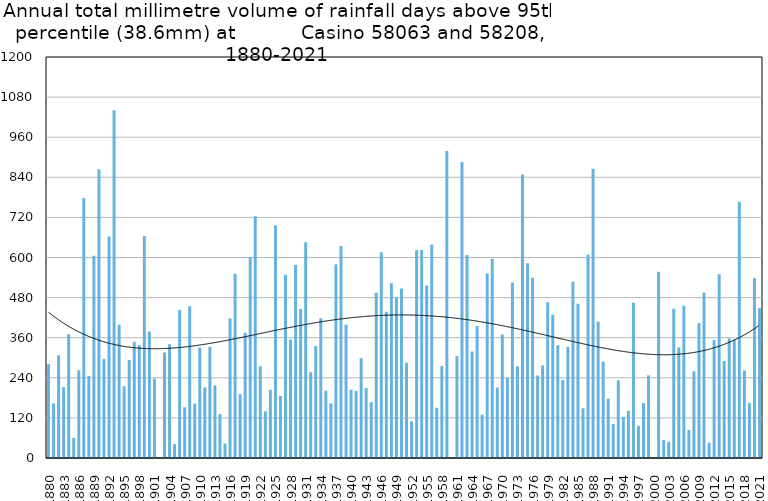
| Category | Annual total mm in days above 95th percentile |
|---|---|
| 1880 | 280.7 |
| 1881 | 163.3 |
| 1882 | 307.4 |
| 1883 | 212.1 |
| 1884 | 370.4 |
| 1885 | 60.2 |
| 1886 | 262.5 |
| 1887 | 778.1 |
| 1888 | 245.1 |
| 1889 | 605.1 |
| 1890 | 864.2 |
| 1891 | 296.2 |
| 1892 | 662.8 |
| 1893 | 1041 |
| 1894 | 399.1 |
| 1895 | 214.6 |
| 1896 | 293.4 |
| 1897 | 348 |
| 1898 | 337.4 |
| 1899 | 664.2 |
| 1900 | 378.3 |
| 1901 | 238.1 |
| 1902 | 0 |
| 1903 | 315.7 |
| 1904 | 340.4 |
| 1905 | 41.4 |
| 1906 | 442.9 |
| 1907 | 151.9 |
| 1908 | 454.2 |
| 1909 | 162.8 |
| 1910 | 330.9 |
| 1911 | 211.3 |
| 1912 | 332.4 |
| 1913 | 216.9 |
| 1914 | 131.3 |
| 1915 | 43.2 |
| 1916 | 417.7 |
| 1917 | 551.5 |
| 1918 | 191 |
| 1919 | 374.9 |
| 1920 | 601.6 |
| 1921 | 723.4 |
| 1922 | 274.5 |
| 1923 | 139.7 |
| 1924 | 204 |
| 1925 | 696.4 |
| 1926 | 185.9 |
| 1927 | 548.2 |
| 1928 | 354.8 |
| 1929 | 577.8 |
| 1930 | 445.9 |
| 1931 | 645.6 |
| 1932 | 256.5 |
| 1933 | 335.6 |
| 1934 | 418.1 |
| 1935 | 201.5 |
| 1936 | 163.6 |
| 1937 | 579.5 |
| 1938 | 634.7 |
| 1939 | 398.9 |
| 1940 | 204.2 |
| 1941 | 200.8 |
| 1942 | 298.9 |
| 1943 | 209.3 |
| 1944 | 167.1 |
| 1945 | 494.5 |
| 1946 | 615.7 |
| 1947 | 437.6 |
| 1948 | 523.2 |
| 1949 | 480.8 |
| 1950 | 507 |
| 1951 | 284.9 |
| 1952 | 110 |
| 1953 | 621.8 |
| 1954 | 622.8 |
| 1955 | 516.1 |
| 1956 | 638.6 |
| 1957 | 150.4 |
| 1958 | 275.3 |
| 1959 | 919 |
| 1960 | 0 |
| 1961 | 304.8 |
| 1962 | 886 |
| 1963 | 607.4 |
| 1964 | 318.5 |
| 1965 | 395 |
| 1966 | 129.6 |
| 1967 | 551.9 |
| 1968 | 596.2 |
| 1969 | 210.6 |
| 1970 | 369.8 |
| 1971 | 239.5 |
| 1972 | 525.2 |
| 1973 | 274.4 |
| 1974 | 848.2 |
| 1975 | 582.8 |
| 1976 | 539.4 |
| 1977 | 246.9 |
| 1978 | 277 |
| 1979 | 466.2 |
| 1980 | 429 |
| 1981 | 337.8 |
| 1982 | 232.8 |
| 1983 | 332.4 |
| 1984 | 528 |
| 1985 | 461.7 |
| 1986 | 148.6 |
| 1987 | 608.6 |
| 1988 | 865.4 |
| 1989 | 407.9 |
| 1990 | 288.4 |
| 1991 | 177.4 |
| 1992 | 101.6 |
| 1993 | 232.8 |
| 1994 | 123.2 |
| 1995 | 141.4 |
| 1996 | 464.6 |
| 1997 | 96.2 |
| 1998 | 164.4 |
| 1999 | 247.4 |
| 2000 | 0 |
| 2001 | 557.4 |
| 2002 | 53.4 |
| 2003 | 48.4 |
| 2004 | 446.6 |
| 2005 | 330.6 |
| 2006 | 455.6 |
| 2007 | 83.6 |
| 2008 | 259.2 |
| 2009 | 403.6 |
| 2010 | 495 |
| 2011 | 45.6 |
| 2012 | 353 |
| 2013 | 549.8 |
| 2014 | 290.4 |
| 2015 | 358 |
| 2016 | 354.4 |
| 2017 | 766.8 |
| 2018 | 261.8 |
| 2019 | 165.2 |
| 2020 | 538.2 |
| 2021 | 448.2 |